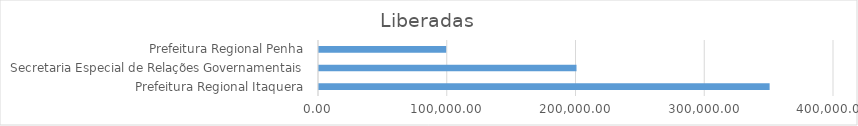
| Category | Series 0 |
|---|---|
| Prefeitura Regional Itaquera | 350000 |
| Secretaria Especial de Relações Governamentais | 200000 |
| Prefeitura Regional Penha | 98781.79 |